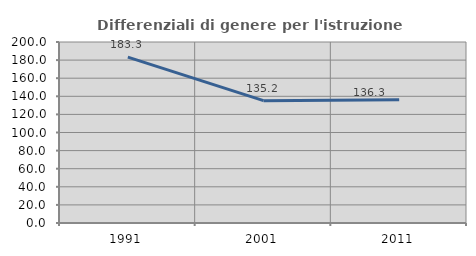
| Category | Differenziali di genere per l'istruzione superiore |
|---|---|
| 1991.0 | 183.288 |
| 2001.0 | 135.166 |
| 2011.0 | 136.303 |